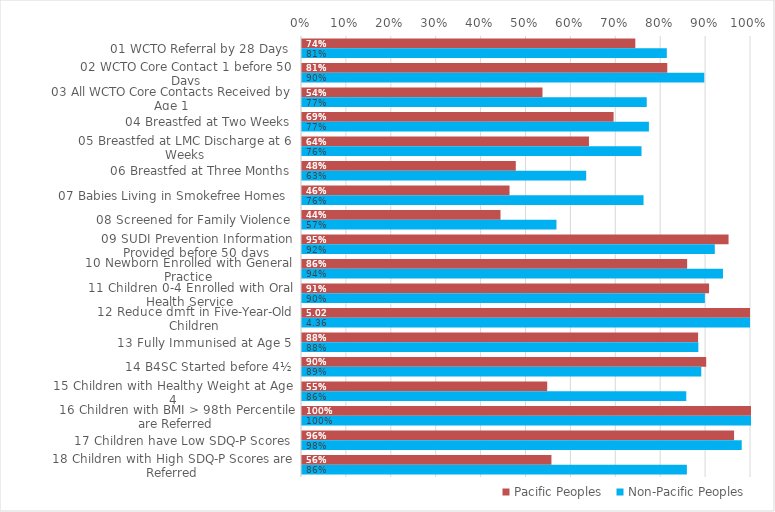
| Category | Pacific Peoples | Non-Pacific Peoples |
|---|---|---|
| 01 WCTO Referral by 28 Days | 0.742 | 0.812 |
| 02 WCTO Core Contact 1 before 50 Days | 0.814 | 0.896 |
| 03 All WCTO Core Contacts Received by Age 1 | 0.536 | 0.768 |
| 04 Breastfed at Two Weeks | 0.694 | 0.773 |
| 05 Breastfed at LMC Discharge at 6 Weeks | 0.639 | 0.756 |
| 06 Breastfed at Three Months | 0.476 | 0.633 |
| 07 Babies Living in Smokefree Homes  | 0.462 | 0.761 |
| 08 Screened for Family Violence | 0.442 | 0.567 |
| 09 SUDI Prevention Information Provided before 50 days | 0.95 | 0.919 |
| 10 Newborn Enrolled with General Practice | 0.858 | 0.938 |
| 11 Children 0-4 Enrolled with Oral Health Service | 0.907 | 0.897 |
| 12 Reduce dmft in Five-Year-Old Children | 5.024 | 4.363 |
| 13 Fully Immunised at Age 5 | 0.882 | 0.883 |
| 14 B4SC Started before 4½ | 0.9 | 0.889 |
| 15 Children with Healthy Weight at Age 4 | 0.546 | 0.856 |
| 16 Children with BMI > 98th Percentile are Referred | 1 | 1 |
| 17 Children have Low SDQ-P Scores | 0.962 | 0.979 |
| 18 Children with High SDQ-P Scores are Referred | 0.556 | 0.857 |